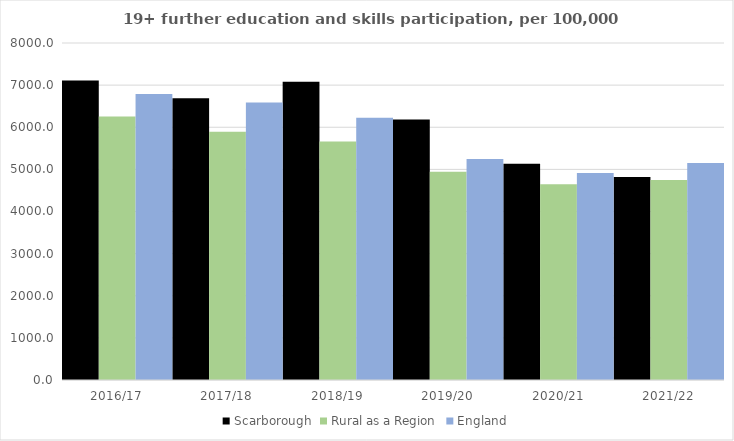
| Category | Scarborough | Rural as a Region | England |
|---|---|---|---|
| 2016/17 | 7109 | 6253.401 | 6788 |
| 2017/18 | 6691 | 5892.029 | 6588 |
| 2018/19 | 7083 | 5661.873 | 6227 |
| 2019/20 | 6185 | 4943.801 | 5244 |
| 2020/21 | 5131 | 4646.727 | 4913 |
| 2021/22 | 4817 | 4747.049 | 5151 |